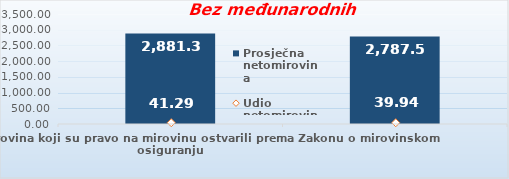
| Category | Prosječna netomirovina  |
|---|---|
| Korisnici mirovina koji su pravo na mirovinu ostvarili prema Zakonu o mirovinskom osiguranju  | 2881.38 |
| Korisnici koji su pravo na mirovinu PRVI PUT ostvarili u 2021. godini prema Zakonu o mirovinskom osiguranju - NOVI KORISNICI | 2787.565 |